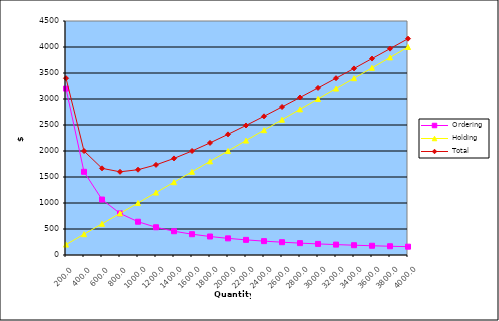
| Category | Ordering | Holding | Total |
|---|---|---|---|
| 200.0 | 3200 | 200 | 3400 |
| 400.0 | 1600 | 400 | 2000 |
| 600.0 | 1066.667 | 600 | 1666.667 |
| 800.0 | 800 | 800 | 1600 |
| 1000.0 | 640 | 1000 | 1640 |
| 1200.0 | 533.333 | 1200 | 1733.333 |
| 1400.0 | 457.143 | 1400 | 1857.143 |
| 1600.0 | 400 | 1600 | 2000 |
| 1800.0 | 355.556 | 1800 | 2155.556 |
| 2000.0 | 320 | 2000 | 2320 |
| 2200.0 | 290.909 | 2200 | 2490.909 |
| 2400.0 | 266.667 | 2400 | 2666.667 |
| 2600.0 | 246.154 | 2600 | 2846.154 |
| 2800.0 | 228.571 | 2800 | 3028.571 |
| 3000.0 | 213.333 | 3000 | 3213.333 |
| 3200.0 | 200 | 3200 | 3400 |
| 3400.0 | 188.235 | 3400 | 3588.235 |
| 3600.0 | 177.778 | 3600 | 3777.778 |
| 3800.0 | 168.421 | 3800 | 3968.421 |
| 4000.0 | 160 | 4000 | 4160 |